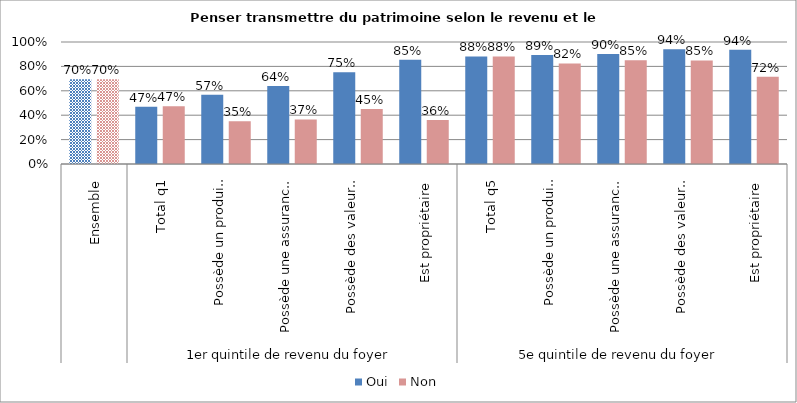
| Category | Oui | Non |
|---|---|---|
| 0 | 0.695 | 0.695 |
| 1 | 0.47 | 0.474 |
| 2 | 0.568 | 0.35 |
| 3 | 0.64 | 0.365 |
| 4 | 0.752 | 0.451 |
| 5 | 0.854 | 0.36 |
| 6 | 0.882 | 0.882 |
| 7 | 0.893 | 0.824 |
| 8 | 0.901 | 0.851 |
| 9 | 0.94 | 0.849 |
| 10 | 0.937 | 0.716 |